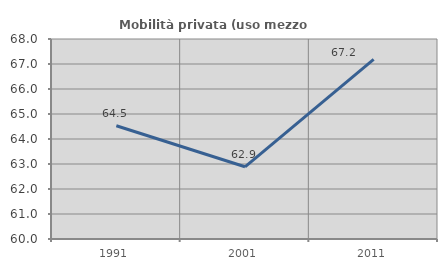
| Category | Mobilità privata (uso mezzo privato) |
|---|---|
| 1991.0 | 64.531 |
| 2001.0 | 62.888 |
| 2011.0 | 67.184 |